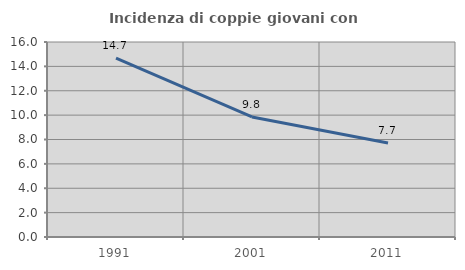
| Category | Incidenza di coppie giovani con figli |
|---|---|
| 1991.0 | 14.675 |
| 2001.0 | 9.848 |
| 2011.0 | 7.708 |